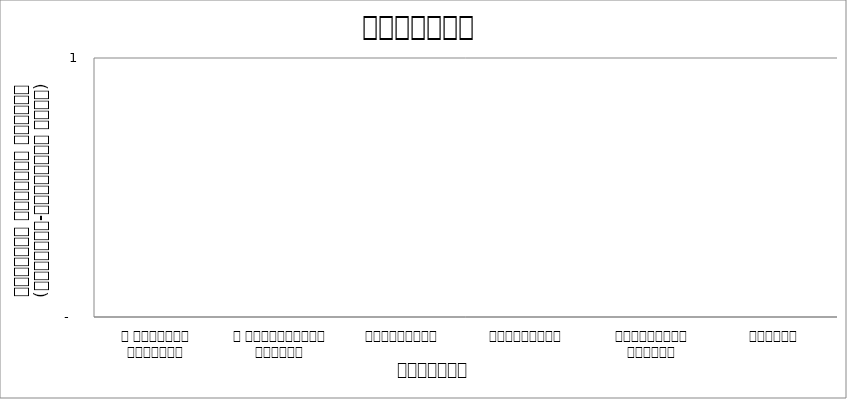
| Category | आन्दोलन |
|---|---|
| द हिमालयन टाइम्स् | 0 |
| द काठमाण्डौं पोस्ट् | 0 |
| रिपब्लिका | 0 |
| कान्तिपुर | 0 |
| अन्नपूर्ण पोस्ट् | 0 |
| नागरिक | 0 |